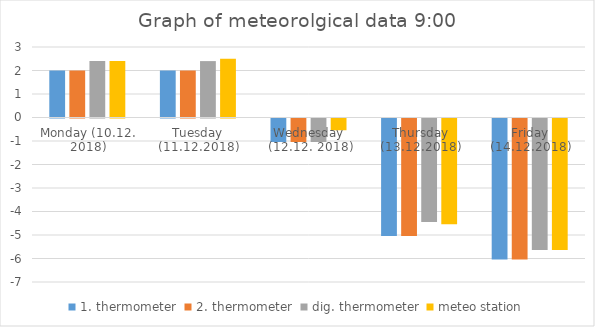
| Category | 1. thermometer | 2. thermometer | dig. thermometer | meteo station |
|---|---|---|---|---|
| Monday (10.12. 2018) | 2 | 2 | 2.4 | 2.4 |
| Tuesday (11.12.2018) | 2 | 2 | 2.4 | 2.5 |
| Wednesday (12.12. 2018) | -1 | -1 | -1 | -0.5 |
| Thursday (13.12.2018) | -5 | -5 | -4.4 | -4.5 |
| Friday (14.12.2018) | -6 | -6 | -5.6 | -5.6 |